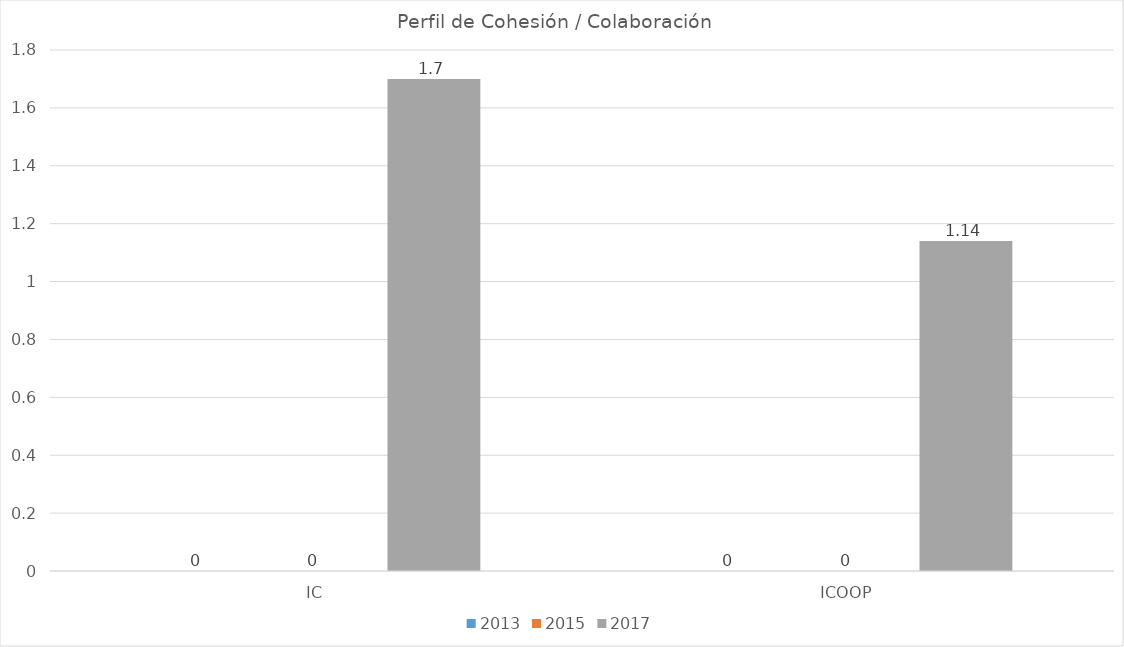
| Category | 2013 | 2015 | 2017 |
|---|---|---|---|
| IC | 0 | 0 | 1.7 |
| ICOOP | 0 | 0 | 1.14 |